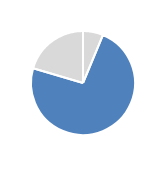
| Category | Series 0 |
|---|---|
| Low Usage | 0.063 |
| Middle Usage | 0.733 |
| High Usage | 0.204 |